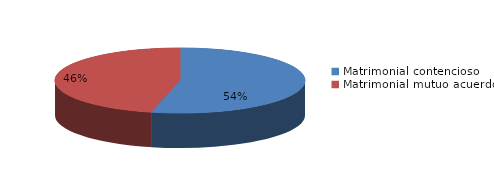
| Category | Series 0 |
|---|---|
| 0 | 227 |
| 1 | 196 |